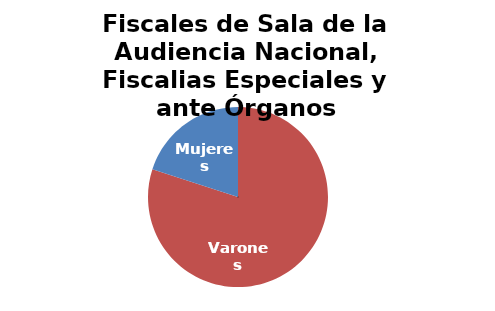
| Category | Fiscales de Sala de la Audiencia Nacional, Fiscalias Especiales y ante Órganos Constitucionales |
|---|---|
| Varones | 4 |
| Mujeres | 1 |